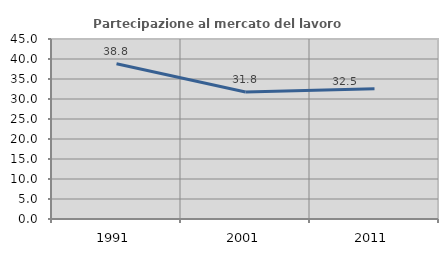
| Category | Partecipazione al mercato del lavoro  femminile |
|---|---|
| 1991.0 | 38.821 |
| 2001.0 | 31.766 |
| 2011.0 | 32.549 |